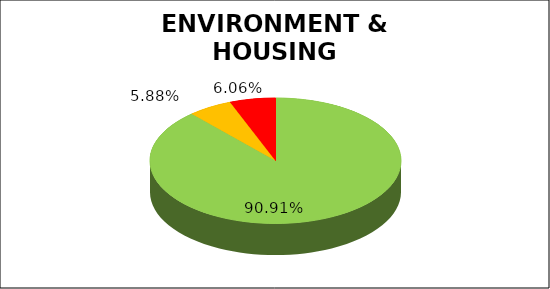
| Category | Q4 |
|---|---|
| Green | 0.909 |
| Amber | 0.059 |
| Red | 0.061 |